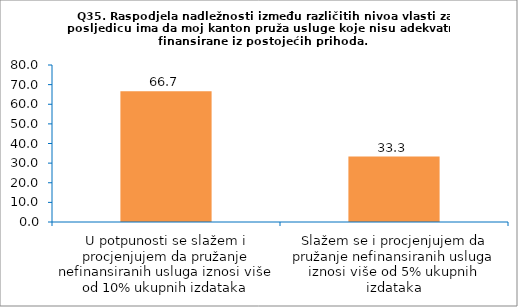
| Category | Series 0 |
|---|---|
| U potpunosti se slažem i procjenjujem da pružanje nefinansiranih usluga iznosi više od 10% ukupnih izdataka | 66.667 |
| Slažem se i procjenjujem da pružanje nefinansiranih usluga iznosi više od 5% ukupnih izdataka | 33.333 |